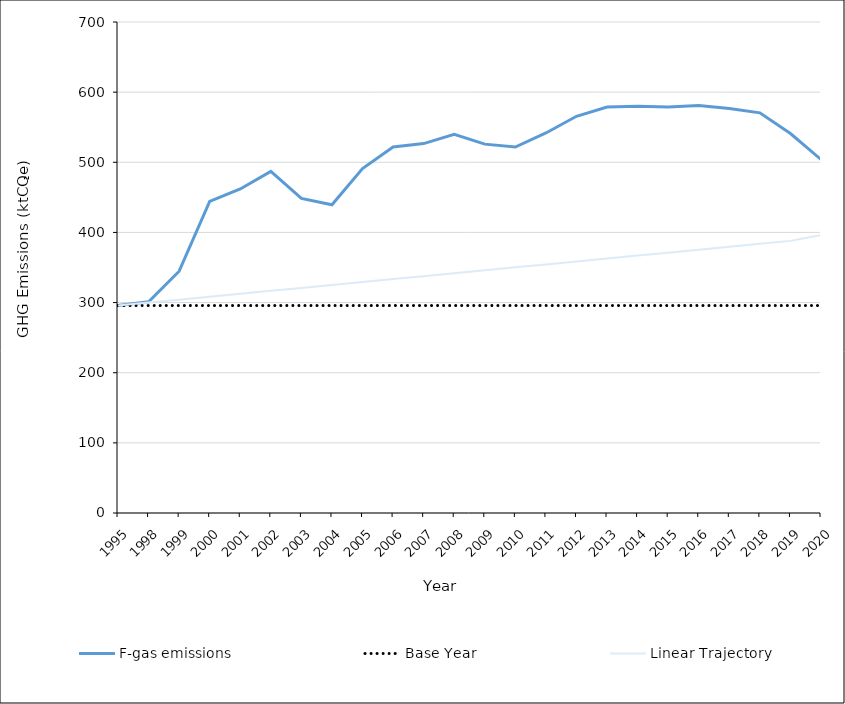
| Category | F-gas emissions | Base Year | CCC's 2020 pathway contribution | Linear Trajectory |
|---|---|---|---|---|
| 1995 | 295.768 | 295.768 |  | 295.768 |
| 1998 | 301.093 | 295.768 |  | 299.958 |
| 1999 | 344.696 | 295.768 |  | 304.148 |
| 2000 | 444.34 | 295.768 |  | 308.338 |
| 2001 | 461.912 | 295.768 |  | 312.529 |
| 2002 | 486.939 | 295.768 |  | 316.719 |
| 2003 | 448.505 | 295.768 |  | 320.909 |
| 2004 | 439.482 | 295.768 |  | 325.099 |
| 2005 | 490.987 | 295.768 |  | 329.289 |
| 2006 | 521.77 | 295.768 |  | 333.479 |
| 2007 | 526.639 | 295.768 |  | 337.669 |
| 2008 | 539.931 | 295.768 |  | 341.859 |
| 2009 | 525.867 | 295.768 |  | 346.049 |
| 2010 | 521.756 | 295.768 |  | 350.239 |
| 2011 | 541.788 | 295.768 |  | 354.429 |
| 2012 | 565.554 | 295.768 |  | 358.619 |
| 2013 | 578.659 | 295.768 |  | 362.809 |
| 2014 | 580.002 | 295.768 |  | 366.999 |
| 2015 | 578.709 | 295.768 |  | 371.189 |
| 2016 | 580.872 | 295.768 |  | 375.379 |
| 2017 | 576.747 | 295.768 |  | 379.569 |
| 2018 | 570.444 | 295.768 |  | 383.759 |
| 2019 | 541.055 | 295.768 |  | 387.949 |
| 2020 | 503.963 | 295.768 |  | 396.33 |